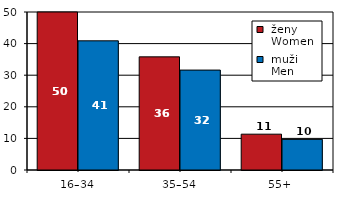
| Category |  ženy 
 Women |  muži 
 Men |
|---|---|---|
| 16–34 | 50.264 | 40.881 |
| 35–54 | 35.806 | 31.619 |
| 55+  | 11.338 | 9.696 |